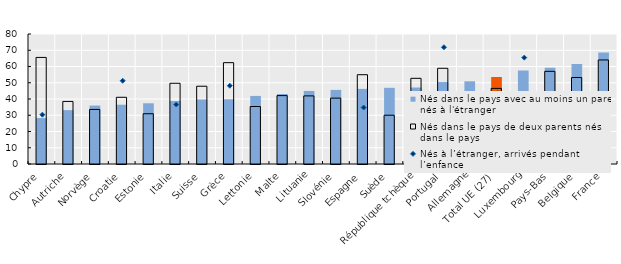
| Category | Nés dans le pays avec au moins un parent nés à l'étranger | Nés dans le pays de deux parents nés dans le pays |
|---|---|---|
| Chypre | 28.262 | 65.582 |
| Autriche | 33.153 | 38.5 |
| Norvège | 35.952 | 33.57 |
| Croatie | 36.472 | 41.052 |
| Estonie | 37.365 | 30.942 |
| Italie | 38.757 | 49.677 |
| Suisse | 39.709 | 47.851 |
| Grèce | 39.848 | 62.364 |
| Lettonie | 41.891 | 35.385 |
| Malte | 43.061 | 42.083 |
| Lituanie | 44.958 | 41.912 |
| Slovénie | 45.594 | 40.538 |
| Espagne | 46.229 | 54.945 |
| Suède | 46.888 | 30.016 |
| République tchèque | 47.069 | 52.727 |
| Portugal | 50.419 | 58.899 |
| Allemagne | 50.879 | 28.353 |
| Total UE (27) | 53.526 | 46.52 |
| Luxembourg | 57.56 | 44.475 |
| Pays-Bas | 59.19 | 57.014 |
| Belgique | 61.541 | 53.212 |
| France | 68.667 | 64.019 |